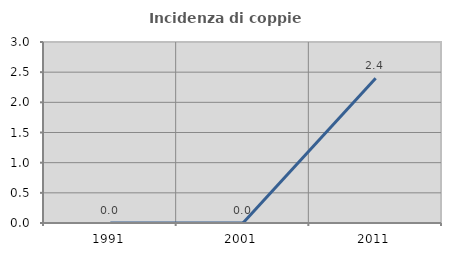
| Category | Incidenza di coppie miste |
|---|---|
| 1991.0 | 0 |
| 2001.0 | 0 |
| 2011.0 | 2.4 |